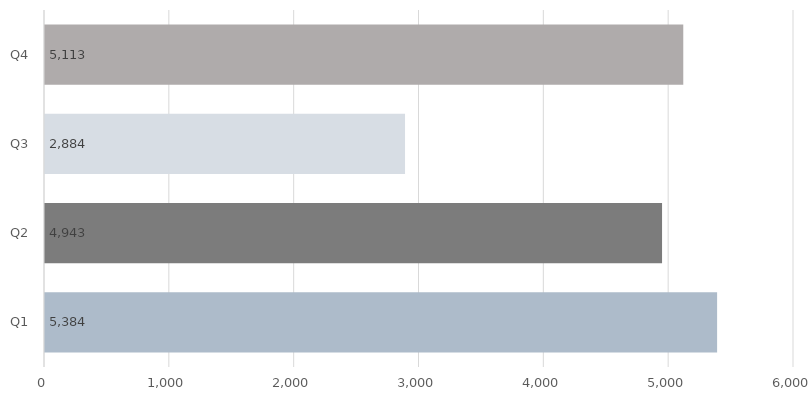
| Category | Series 0 |
|---|---|
| Q1 | 5384 |
| Q2 | 4943 |
| Q3 | 2884 |
| Q4 | 5113 |